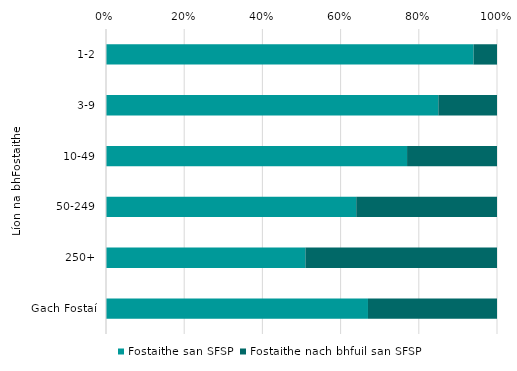
| Category | Fostaithe san SFSP | Fostaithe nach bhfuil san SFSP |
|---|---|---|
| 1-2 | 0.94 | 0.06 |
| 3-9 | 0.85 | 0.15 |
| 10-49 | 0.77 | 0.23 |
| 50-249 | 0.64 | 0.36 |
| 250+ | 0.51 | 0.49 |
| Gach Fostaí | 0.67 | 0.33 |